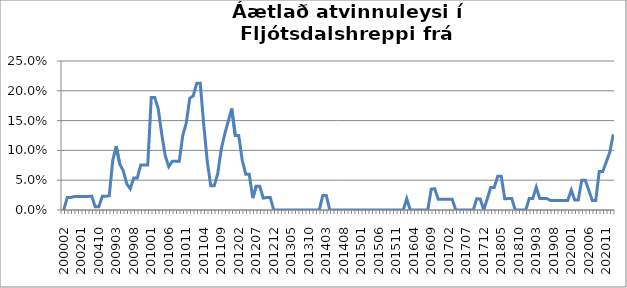
| Category | Series 0 |
|---|---|
| 200002 | 0 |
| 200102 | 0.021 |
| 200103 | 0.021 |
| 200111 | 0.023 |
| 200112 | 0.023 |
| 200201 | 0.023 |
| 200211 | 0.023 |
| 200212 | 0.023 |
| 200302 | 0.023 |
| 200409 | 0.005 |
| 200410 | 0.005 |
| 200811 | 0.023 |
| 200812 | 0.023 |
| 200901 | 0.024 |
| 200902 | 0.083 |
| 200903 | 0.107 |
| 200904 | 0.077 |
| 200905 | 0.066 |
| 200906 | 0.044 |
| 200907 | 0.036 |
| 200908 | 0.054 |
| 200909 | 0.054 |
| 200910 | 0.075 |
| 200911 | 0.075 |
| 200912 | 0.075 |
| 201001 | 0.189 |
| 201002 | 0.189 |
| 201003 | 0.17 |
| 201004 | 0.127 |
| 201005 | 0.091 |
| 201006 | 0.073 |
| 201007 | 0.082 |
| 201008 | 0.082 |
| 201009 | 0.082 |
| 201010 | 0.125 |
| 201011 | 0.146 |
| 201012 | 0.188 |
| 201101 | 0.191 |
| 201102 | 0.213 |
| 201103 | 0.213 |
| 201104 | 0.143 |
| 201105 | 0.082 |
| 201106 | 0.041 |
| 201107 | 0.041 |
| 201108 | 0.061 |
| 201109 | 0.102 |
| 201110 | 0.128 |
| 201111 | 0.149 |
| 201112 | 0.17 |
| 201201 | 0.125 |
| 201202 | 0.125 |
| 201203 | 0.083 |
| 201204 | 0.06 |
| 201205 | 0.06 |
| 201206 | 0.02 |
| 201207 | 0.04 |
| 201208 | 0.04 |
| 201209 | 0.02 |
| 201210 | 0.021 |
| 201211 | 0.021 |
| 201212 | 0 |
| 201301 | 0 |
| 201302 | 0 |
| 201303 | 0 |
| 201304 | 0 |
| 201305 | 0 |
| 201306 | 0 |
| 201307 | 0 |
| 201308 | 0 |
| 201309 | 0 |
| 201310 | 0 |
| 201311 | 0 |
| 201312 | 0 |
| 201401 | 0 |
| 201402 | 0.024 |
| 201403 | 0.024 |
| 201404 | 0 |
| 201405 | 0 |
| 201406 | 0 |
| 201407 | 0 |
| 201408 | 0 |
| 201409 | 0 |
| 201410 | 0 |
| 201411 | 0 |
| 201412 | 0 |
| 201501 | 0 |
| 201502 | 0 |
| 201503 | 0 |
| 201504 | 0 |
| 201505 | 0 |
| 201506 | 0 |
| 201507 | 0 |
| 201508 | 0 |
| 201509 | 0 |
| 201510 | 0 |
| 201511 | 0 |
| 201512 | 0 |
| 201601 | 0 |
| 201602 | 0.019 |
| 201603 | 0 |
| 201604 | 0 |
| 201605 | 0 |
| 201606 | 0 |
| 201607 | 0 |
| 201608 | 0 |
| 201609 | 0.035 |
| 201610 | 0.036 |
| 201611 | 0.018 |
| 201612 | 0.018 |
| 201701 | 0.018 |
| 201702 | 0.018 |
| 201703 | 0.018 |
| 201704 | 0 |
| 201705 | 0 |
| 201706 | 0 |
| 201707 | 0 |
| 201708 | 0 |
| 201709 | 0 |
| 201710 | 0.019 |
| 201711 | 0.019 |
| 201712 | 0 |
| 201801 | 0.019 |
| 201802 | 0.038 |
| 201803 | 0.038 |
| 201804 | 0.057 |
| 201805 | 0.057 |
| 201806 | 0.019 |
| 201807 | 0.019 |
| 201808 | 0.019 |
| 201809 | 0 |
| 201810 | 0 |
| 201811 | 0 |
| 201812 | 0 |
| 201901 | 0.019 |
| 201902 | 0.019 |
| 201903 | 0.038 |
| 201904 | 0.019 |
| 201905 | 0.019 |
| 201906 | 0.019 |
| 201907 | 0.016 |
| 201908 | 0.016 |
| 201909 | 0.016 |
| 201910 | 0.016 |
| 201911 | 0.016 |
| 201912 | 0.016 |
| 202001 | 0.033 |
| 202002 | 0.017 |
| 202003*** | 0.017 |
| 202004 | 0.05 |
| 202005 | 0.05 |
| 202006 | 0.033 |
| 202007 | 0.016 |
| 202008 | 0.016 |
| 202009 | 0.065 |
| 202010 | 0.065 |
| 202011 | 0.081 |
| 202012 | 0.097 |
| 202101 | 0.127 |